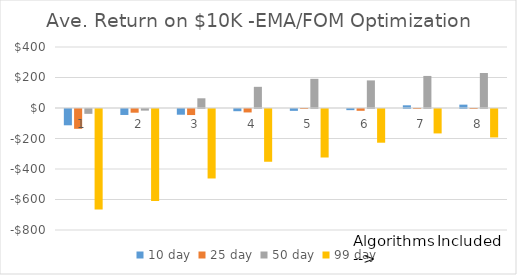
| Category | 10 day | 25 day | 50 day | 99 day |
|---|---|---|---|---|
| 1.0 | -106.869 | -129.934 | -31.768 | -658.463 |
| 2.0 | -39.12 | -24.317 | -10.7 | -603.861 |
| 3.0 | -37.479 | -39.635 | 63.657 | -455.622 |
| 4.0 | -14.489 | -22.617 | 138.838 | -345.87 |
| 5.0 | -12.212 | 0.115 | 191.351 | -318.042 |
| 6.0 | -7.565 | -11.845 | 180.928 | -221.079 |
| 7.0 | 17.721 | 0.311 | 210.253 | -160.168 |
| 8.0 | 22.049 | -0.156 | 229.59 | -186.5 |